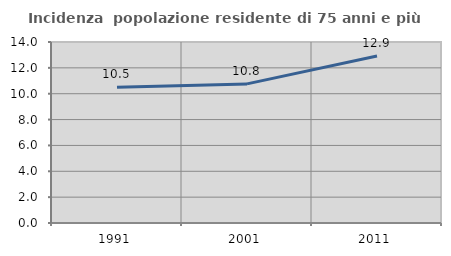
| Category | Incidenza  popolazione residente di 75 anni e più |
|---|---|
| 1991.0 | 10.499 |
| 2001.0 | 10.761 |
| 2011.0 | 12.923 |